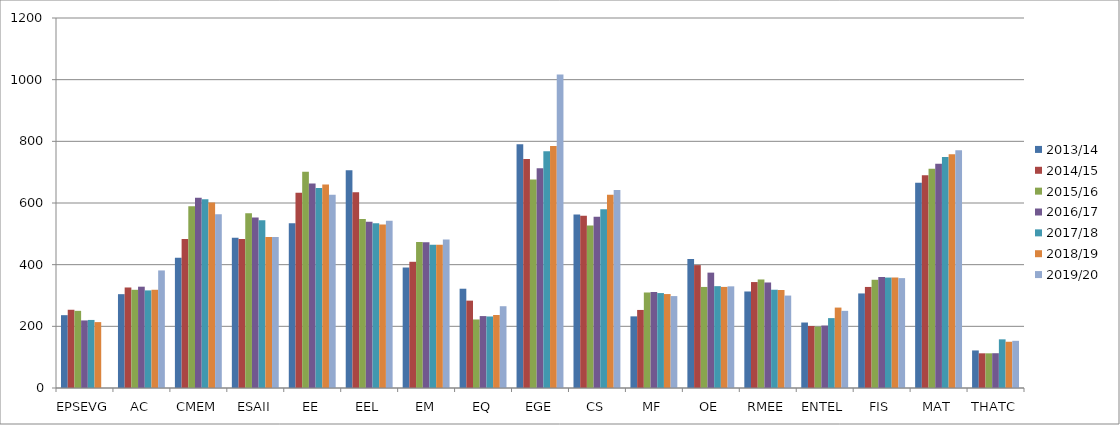
| Category | 2013/14 | 2014/15 | 2015/16 | 2016/17 | 2017/18 | 2018/19 | 2019/20 |
|---|---|---|---|---|---|---|---|
| EPSEVG | 236.21 | 253.76 | 250.25 | 219.142 | 220.742 | 213.699 | 0 |
| AC | 304.33 | 326 | 318.5 | 328.58 | 316.55 | 318.61 | 381.28 |
| CMEM | 422.78 | 483.14 | 589.525 | 617.17 | 612.267 | 601.49 | 563.118 |
| ESAII | 486.94 | 483.27 | 567 | 552.905 | 544.059 | 489.96 | 489.831 |
| EE | 534.44 | 633.19 | 701.6 | 663.57 | 648.45 | 660.34 | 626.371 |
| EEL | 705.89 | 634.64 | 548.15 | 538.866 | 534.172 | 529.952 | 542.478 |
| EM | 390.72 | 409.34 | 473.13 | 472.71 | 464.5 | 464.2 | 481.55 |
| EQ | 321.99 | 283.35 | 222.25 | 233.248 | 231.946 | 236.746 | 265.245 |
| EGE | 790.58 | 742.58 | 675.95 | 712.96 | 767.517 | 785.03 | 1016.44 |
| CS | 562.37 | 559.01 | 526.91 | 555.16 | 579.6 | 626.94 | 641.92 |
| MF | 232.35 | 253.14 | 309.75 | 311.278 | 307.891 | 304.662 | 298.108 |
| OE | 418.04 | 398.58 | 327.765 | 374.17 | 330.3 | 327.85 | 329.7 |
| RMEE | 313.03 | 343.6 | 351.98 | 342.22 | 318.7 | 317.9 | 299.8 |
| ENTEL | 212.37 | 201.01 | 199 | 202.495 | 226.655 | 260.831 | 250.189 |
| FIS | 306.68 | 327.75 | 351 | 360 | 358.2 | 358.4 | 356.35 |
| MAT | 665.55 | 690 | 710.75 | 727.062 | 749.349 | 758.19 | 770.871 |
| THATC | 121.8 | 112.5 | 112.5 | 112.804 | 157.804 | 150 | 153 |